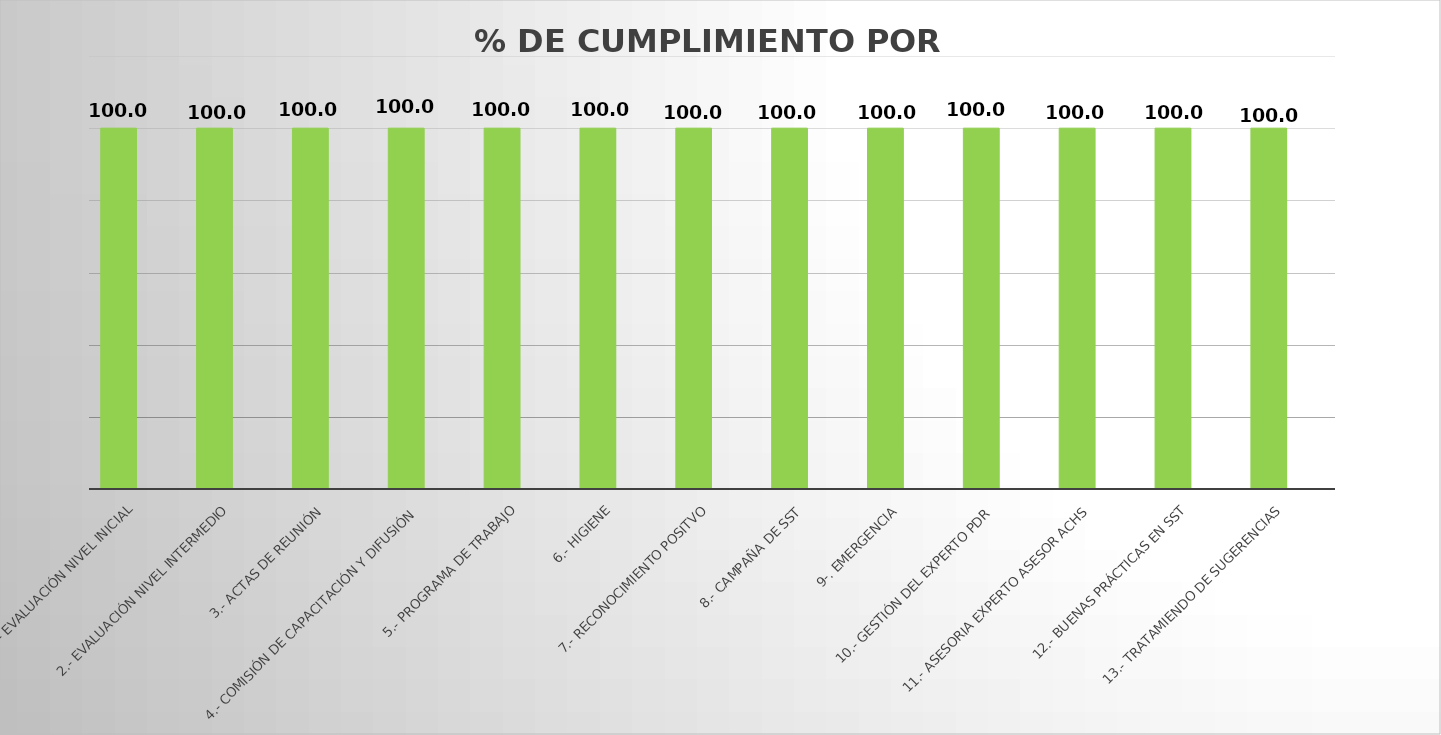
| Category | Series 0 | Series 1 |
|---|---|---|
| 1.- EVALUACIÓN NIVEL INICIAL | 100 |  |
| 2.- EVALUACIÓN NIVEL INTERMEDIO | 100 |  |
| 3.- ACTAS DE REUNIÓN | 100 |  |
| 4.- COMISIÓN DE CAPACITACIÓN Y DIFUSIÓN | 100 |  |
| 5.- PROGRAMA DE TRABAJO | 100 |  |
| 6.- HIGIENE | 100 |  |
| 7.- RECONOCIMIENTO POSITVO | 100 |  |
| 8.- CAMPAÑA DE SST | 100 |  |
| 9-. EMERGENCIA | 100 |  |
| 10.- GESTIÓN DEL EXPERTO PDR | 100 |  |
| 11.- ASESORIA EXPERTO ASESOR ACHS | 100 |  |
| 12.- BUENAS PRÁCTICAS EN SST | 100 |  |
| 13.- TRATAMIENDO DE SUGERENCIAS | 100 |  |